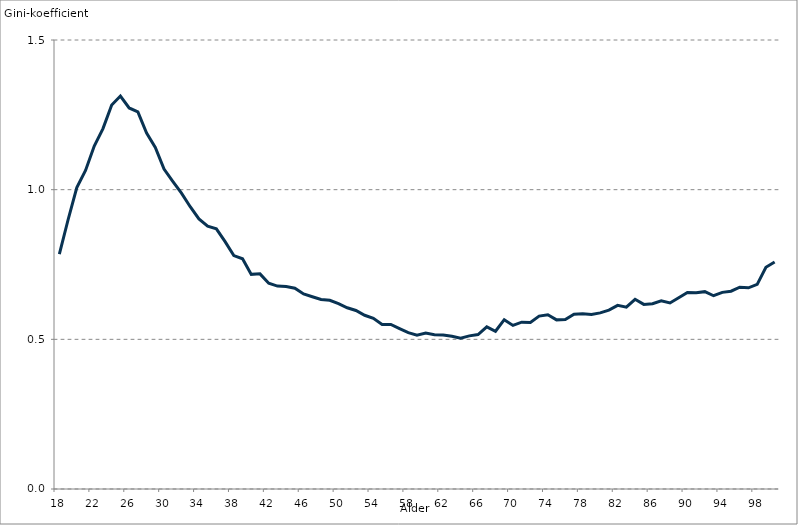
| Category | Nettoformue, inkl. pension |
|---|---|
| 18.0 | 0.785 |
| 19.0 | 0.9 |
| 20.0 | 1.007 |
| 21.0 | 1.064 |
| 22.0 | 1.145 |
| 23.0 | 1.204 |
| 24.0 | 1.283 |
| 25.0 | 1.313 |
| 26.0 | 1.273 |
| 27.0 | 1.26 |
| 28.0 | 1.189 |
| 29.0 | 1.141 |
| 30.0 | 1.069 |
| 31.0 | 1.028 |
| 32.0 | 0.988 |
| 33.0 | 0.943 |
| 34.0 | 0.902 |
| 35.0 | 0.878 |
| 36.0 | 0.869 |
| 37.0 | 0.826 |
| 38.0 | 0.78 |
| 39.0 | 0.769 |
| 40.0 | 0.717 |
| 41.0 | 0.719 |
| 42.0 | 0.687 |
| 43.0 | 0.678 |
| 44.0 | 0.677 |
| 45.0 | 0.671 |
| 46.0 | 0.651 |
| 47.0 | 0.642 |
| 48.0 | 0.633 |
| 49.0 | 0.63 |
| 50.0 | 0.619 |
| 51.0 | 0.606 |
| 52.0 | 0.596 |
| 53.0 | 0.58 |
| 54.0 | 0.57 |
| 55.0 | 0.55 |
| 56.0 | 0.55 |
| 57.0 | 0.536 |
| 58.0 | 0.523 |
| 59.0 | 0.514 |
| 60.0 | 0.521 |
| 61.0 | 0.516 |
| 62.0 | 0.514 |
| 63.0 | 0.51 |
| 64.0 | 0.504 |
| 65.0 | 0.512 |
| 66.0 | 0.516 |
| 67.0 | 0.542 |
| 68.0 | 0.527 |
| 69.0 | 0.566 |
| 70.0 | 0.547 |
| 71.0 | 0.557 |
| 72.0 | 0.556 |
| 73.0 | 0.578 |
| 74.0 | 0.582 |
| 75.0 | 0.565 |
| 76.0 | 0.566 |
| 77.0 | 0.584 |
| 78.0 | 0.586 |
| 79.0 | 0.583 |
| 80.0 | 0.588 |
| 81.0 | 0.598 |
| 82.0 | 0.613 |
| 83.0 | 0.607 |
| 84.0 | 0.634 |
| 85.0 | 0.617 |
| 86.0 | 0.619 |
| 87.0 | 0.629 |
| 88.0 | 0.621 |
| 89.0 | 0.639 |
| 90.0 | 0.657 |
| 91.0 | 0.656 |
| 92.0 | 0.659 |
| 93.0 | 0.646 |
| 94.0 | 0.657 |
| 95.0 | 0.661 |
| 96.0 | 0.674 |
| 97.0 | 0.672 |
| 98.0 | 0.684 |
| 99.0 | 0.741 |
| 100.0 | 0.758 |